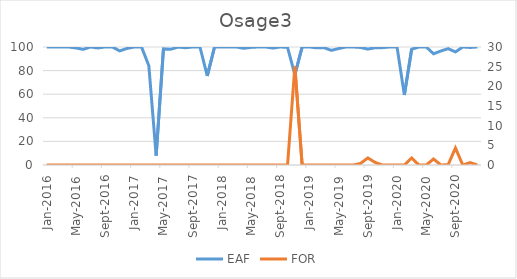
| Category | EAF |
|---|---|
| 2016-01-01 | 100 |
| 2016-02-01 | 99.93 |
| 2016-03-01 | 100 |
| 2016-04-01 | 100 |
| 2016-05-01 | 99.19 |
| 2016-06-01 | 98 |
| 2016-07-01 | 100 |
| 2016-08-01 | 99.18 |
| 2016-09-01 | 100 |
| 2016-10-01 | 100 |
| 2016-11-01 | 96.72 |
| 2016-12-01 | 98.74 |
| 2017-01-01 | 100 |
| 2017-02-01 | 100 |
| 2017-03-01 | 84.07 |
| 2017-04-01 | 7.92 |
| 2017-05-01 | 98.45 |
| 2017-06-01 | 98.01 |
| 2017-07-01 | 100 |
| 2017-08-01 | 99.46 |
| 2017-09-01 | 100 |
| 2017-10-01 | 100 |
| 2017-11-01 | 75.45 |
| 2017-12-01 | 100 |
| 2018-01-01 | 100 |
| 2018-02-01 | 100 |
| 2018-03-01 | 100 |
| 2018-04-01 | 98.89 |
| 2018-05-01 | 99.66 |
| 2018-06-01 | 100 |
| 2018-07-01 | 100 |
| 2018-08-01 | 99.09 |
| 2018-09-01 | 100 |
| 2018-10-01 | 99.65 |
| 2018-11-01 | 76.49 |
| 2018-12-01 | 100 |
| 2019-01-01 | 100 |
| 2019-02-01 | 99.26 |
| 2019-03-01 | 99.39 |
| 2019-04-01 | 97.15 |
| 2019-05-01 | 98.68 |
| 2019-06-01 | 100 |
| 2019-07-01 | 100 |
| 2019-08-01 | 99.6 |
| 2019-09-01 | 98.2 |
| 2019-10-01 | 99.4 |
| 2019-11-01 | 99.45 |
| 2019-12-01 | 100 |
| 2020-01-01 | 100 |
| 2020-02-01 | 59.34 |
| 2020-03-01 | 98.1 |
| 2020-04-01 | 100 |
| 2020-05-01 | 100 |
| 2020-06-01 | 94.25 |
| 2020-07-01 | 96.59 |
| 2020-08-01 | 98.61 |
| 2020-09-01 | 95.82 |
| 2020-10-01 | 100 |
| 2020-11-01 | 99.61 |
| 2020-12-01 | 100 |